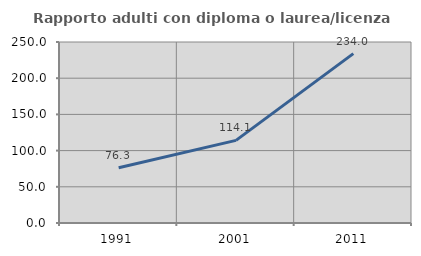
| Category | Rapporto adulti con diploma o laurea/licenza media  |
|---|---|
| 1991.0 | 76.344 |
| 2001.0 | 114.13 |
| 2011.0 | 234 |